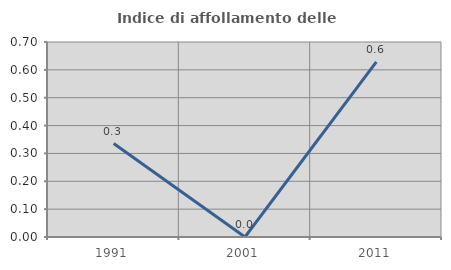
| Category | Indice di affollamento delle abitazioni  |
|---|---|
| 1991.0 | 0.336 |
| 2001.0 | 0 |
| 2011.0 | 0.629 |